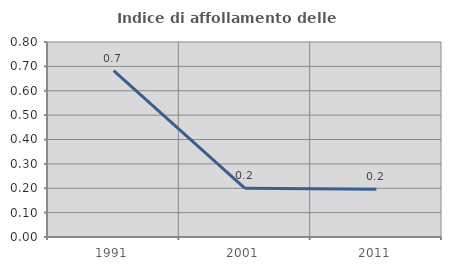
| Category | Indice di affollamento delle abitazioni  |
|---|---|
| 1991.0 | 0.683 |
| 2001.0 | 0.2 |
| 2011.0 | 0.196 |